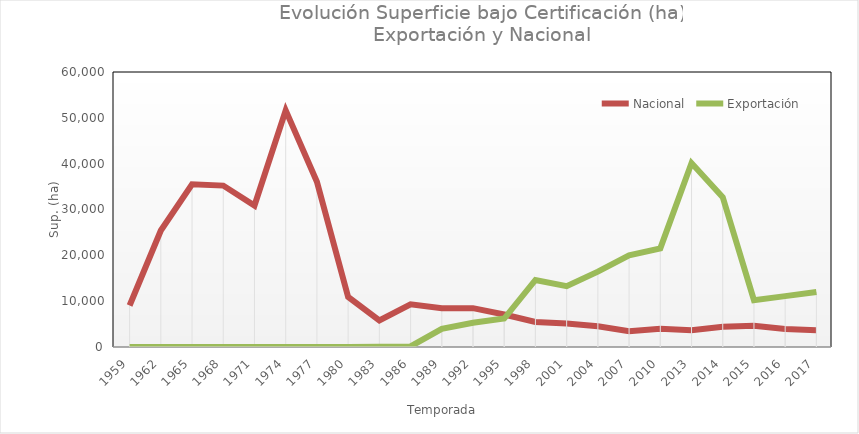
| Category | Nacional | Exportación |
|---|---|---|
| 1959.0 | 9053 | 0 |
| 1962.0 | 25417 | 0 |
| 1965.0 | 35485 | 0 |
| 1968.0 | 35216 | 0 |
| 1971.0 | 30869 | 0 |
| 1974.0 | 51638 | 0 |
| 1977.0 | 36049 | 0 |
| 1980.0 | 10916 | 0 |
| 1983.0 | 5799 | 67 |
| 1986.0 | 9313 | 134 |
| 1989.0 | 8433 | 3957 |
| 1992.0 | 8479 | 5276 |
| 1995.0 | 7087 | 6206 |
| 1998.0 | 5461 | 14621 |
| 2001.0 | 5121 | 13275 |
| 2004.0 | 4517 | 16439 |
| 2007.0 | 3448 | 19979 |
| 2010.0 | 3989 | 21512 |
| 2013.0 | 3662 | 40125 |
| 2014.0 | 4409 | 32693 |
| 2015.0 | 4636 | 10219 |
| 2016.0 | 3913.038 | 11097.226 |
| 2017.0 | 3643.48 | 11996.323 |